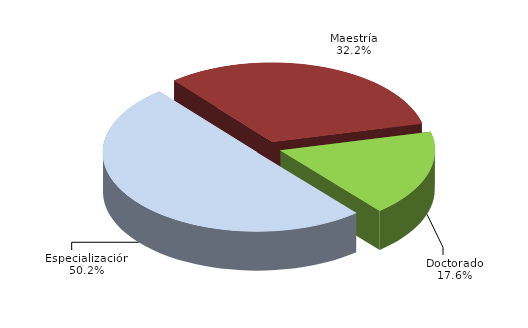
| Category | Series 0 |
|---|---|
| Especialización | 15096 |
| Maestría | 9680 |
| Doctorado | 5313 |